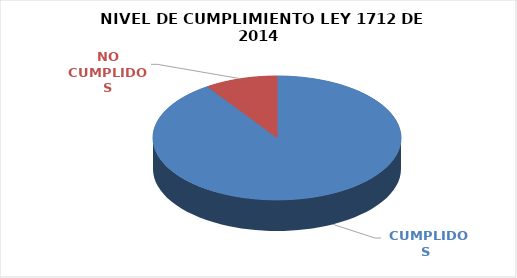
| Category | Series 0 |
|---|---|
|  CUMPLIDOS | 105 |
| NO CUMPLIDOS | 11 |